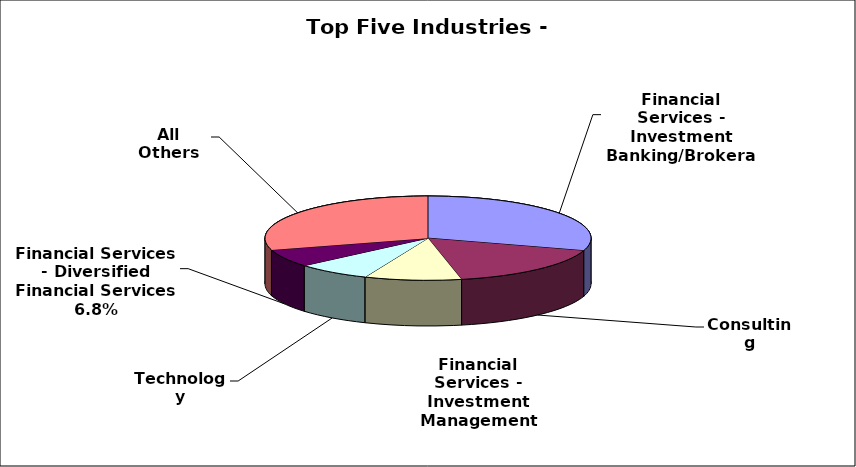
| Category | Series 0 |
|---|---|
| Financial Services - Investment Banking/Brokerage | 0.298 |
| Consulting | 0.169 |
| Financial Services - Investment Management | 0.096 |
| Technology | 0.074 |
| Financial Services - Diversified Financial Services | 0.068 |
| All Others | 0.295 |